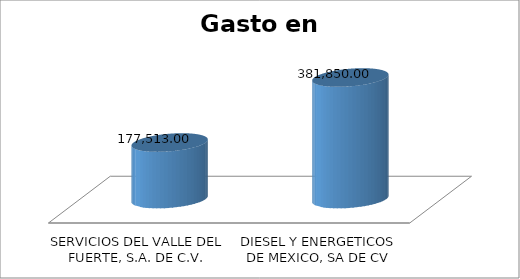
| Category | Suma |
|---|---|
| SERVICIOS DEL VALLE DEL FUERTE, S.A. DE C.V. | 177513 |
| DIESEL Y ENERGETICOS DE MEXICO, SA DE CV | 381850 |